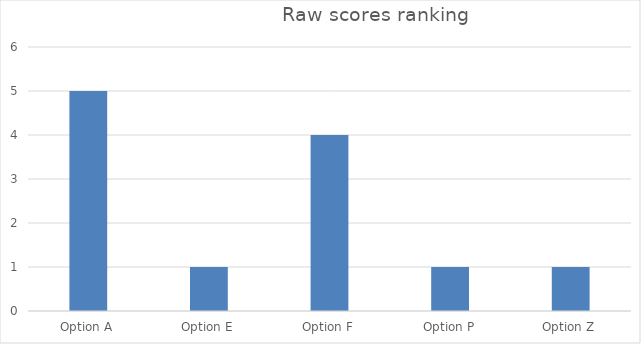
| Category | RANK |
|---|---|
| Option A | 5 |
| Option E | 1 |
| Option F | 4 |
| Option P | 1 |
| Option Z | 1 |